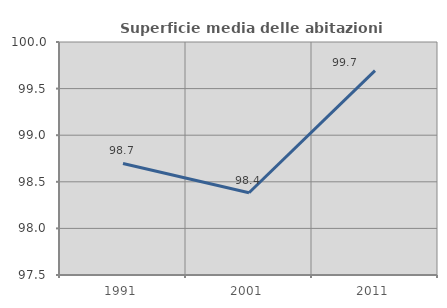
| Category | Superficie media delle abitazioni occupate |
|---|---|
| 1991.0 | 98.696 |
| 2001.0 | 98.383 |
| 2011.0 | 99.693 |